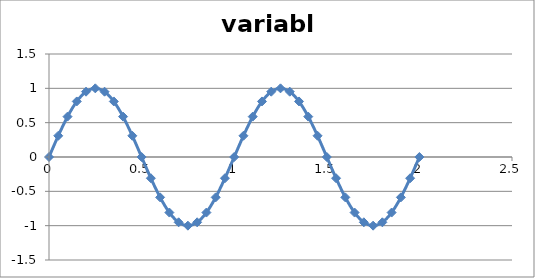
| Category | variable |
|---|---|
| 0.0 | 0 |
| 0.05 | 0.309 |
| 0.1 | 0.588 |
| 0.15 | 0.809 |
| 0.2 | 0.951 |
| 0.25 | 1 |
| 0.3 | 0.951 |
| 0.35 | 0.809 |
| 0.4 | 0.588 |
| 0.45 | 0.309 |
| 0.5 | 0 |
| 0.55 | -0.309 |
| 0.6 | -0.588 |
| 0.65 | -0.809 |
| 0.7 | -0.951 |
| 0.75 | -1 |
| 0.8 | -0.951 |
| 0.85 | -0.809 |
| 0.9 | -0.588 |
| 0.95 | -0.309 |
| 1.0 | 0 |
| 1.05 | 0.309 |
| 1.1 | 0.588 |
| 1.15 | 0.809 |
| 1.2 | 0.951 |
| 1.25 | 1 |
| 1.3 | 0.951 |
| 1.35 | 0.809 |
| 1.4 | 0.588 |
| 1.45 | 0.309 |
| 1.5 | 0 |
| 1.55 | -0.309 |
| 1.6 | -0.588 |
| 1.65 | -0.809 |
| 1.7 | -0.951 |
| 1.75 | -1 |
| 1.8 | -0.951 |
| 1.85 | -0.809 |
| 1.9 | -0.588 |
| 1.95 | -0.309 |
| 2.0 | 0 |